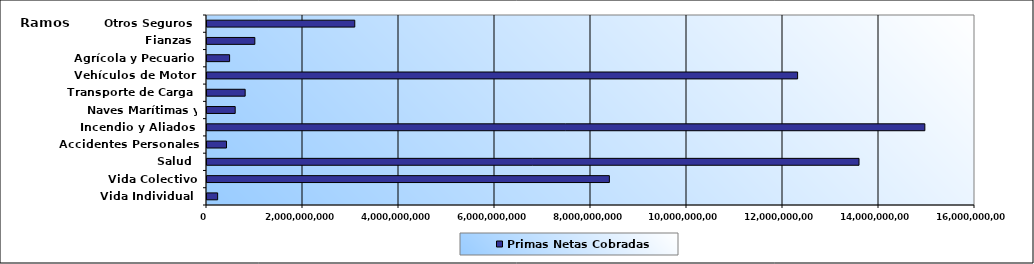
| Category | Primas Netas Cobradas |
|---|---|
| Vida Individual  | 221832496.43 |
| Vida Colectivo | 8382858347.65 |
| Salud  | 13583712672.58 |
| Accidentes Personales | 405790066.25 |
| Incendio y Aliados  | 14955306608.65 |
| Naves Marítimas y Aéreas  | 587476171.43 |
| Transporte de Carga  | 795087468.24 |
| Vehículos de Motor  | 12304506882.03 |
| Agrícola y Pecuario  | 470732415.68 |
| Fianzas  | 996737574.5 |
| Otros Seguros  | 3078595554.98 |